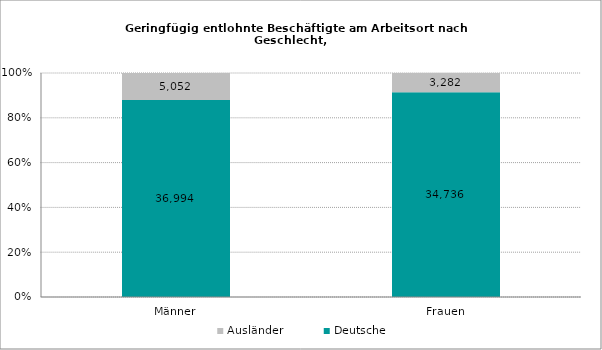
| Category | Deutsche | Ausländer |
|---|---|---|
| Männer | 36994 | 5052 |
| Frauen | 34736 | 3282 |